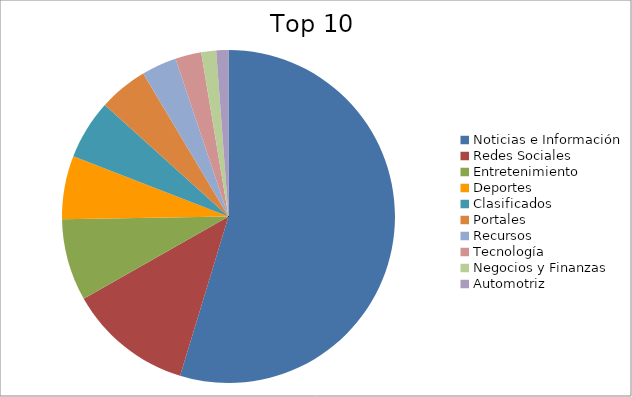
| Category | Series 0 |
|---|---|
| Noticias e Información | 51.89 |
| Redes Sociales | 11.46 |
| Entretenimiento | 7.56 |
| Deportes | 5.84 |
| Clasificados | 5.48 |
| Portales | 4.52 |
| Recursos | 3.23 |
| Tecnología | 2.4 |
| Negocios y Finanzas | 1.37 |
| Automotriz | 1.12 |